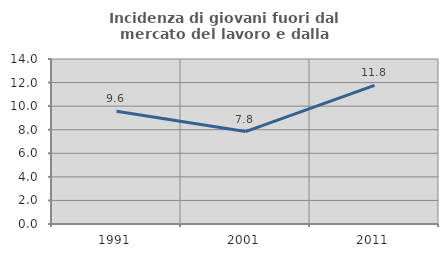
| Category | Incidenza di giovani fuori dal mercato del lavoro e dalla formazione  |
|---|---|
| 1991.0 | 9.574 |
| 2001.0 | 7.843 |
| 2011.0 | 11.765 |